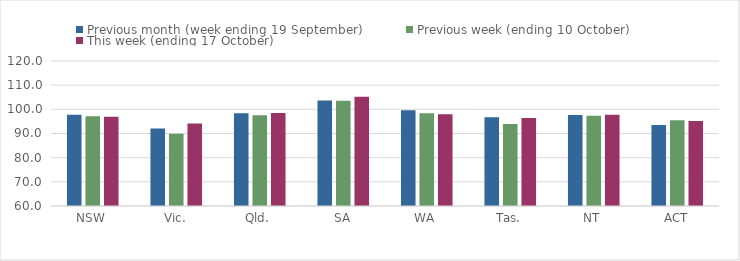
| Category | Previous month (week ending 19 September) | Previous week (ending 10 October) | This week (ending 17 October) |
|---|---|---|---|
| NSW | 97.73 | 97.17 | 96.93 |
| Vic. | 92.09 | 89.9 | 94.11 |
| Qld. | 98.41 | 97.57 | 98.44 |
| SA | 103.63 | 103.57 | 105.25 |
| WA | 99.67 | 98.41 | 97.97 |
| Tas. | 96.72 | 93.91 | 96.37 |
| NT | 97.63 | 97.37 | 97.78 |
| ACT | 93.55 | 95.45 | 95.16 |